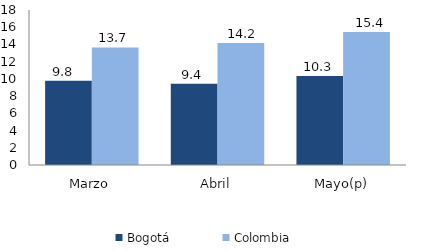
| Category | Bogotá | Colombia |
|---|---|---|
| Marzo | 9.778 | 13.651 |
| Abril | 9.442 | 14.16 |
| Mayo(p) | 10.327 | 15.437 |